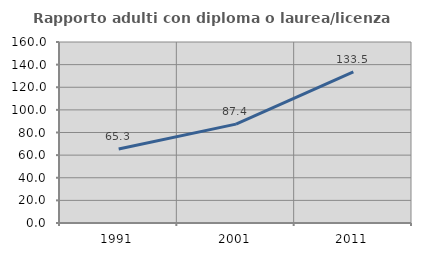
| Category | Rapporto adulti con diploma o laurea/licenza media  |
|---|---|
| 1991.0 | 65.347 |
| 2001.0 | 87.381 |
| 2011.0 | 133.537 |